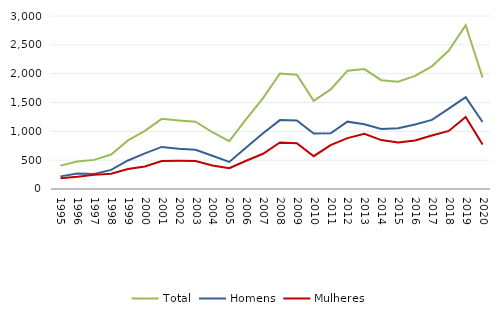
| Category | Total | Homens | Mulheres |
|---|---|---|---|
| 1995.0 | 405 | 219 | 186 |
| 1996.0 | 478 | 267 | 211 |
| 1997.0 | 505 | 260 | 245 |
| 1998.0 | 597 | 332 | 265 |
| 1999.0 | 842 | 495 | 347 |
| 2000.0 | 1009 | 619 | 390 |
| 2001.0 | 1216 | 730 | 486 |
| 2002.0 | 1189 | 700 | 489 |
| 2003.0 | 1166 | 679 | 487 |
| 2004.0 | 984 | 577 | 407 |
| 2005.0 | 830 | 470 | 360 |
| 2006.0 | 1211 | 721 | 490 |
| 2007.0 | 1577 | 966 | 611 |
| 2008.0 | 2002 | 1195 | 807 |
| 2009.0 | 1983 | 1188 | 795 |
| 2010.0 | 1530 | 961 | 569 |
| 2011.0 | 1727 | 966 | 761 |
| 2012.0 | 2051 | 1168 | 883 |
| 2013.0 | 2079 | 1122 | 957 |
| 2014.0 | 1887 | 1039 | 848 |
| 2015.0 | 1860 | 1053 | 807 |
| 2016.0 | 1961 | 1120 | 841 |
| 2017.0 | 2127 | 1198 | 929 |
| 2018.0 | 2400 | 1393 | 1007 |
| 2019.0 | 2841 | 1593 | 1248 |
| 2020.0 | 1933 | 1162 | 771 |